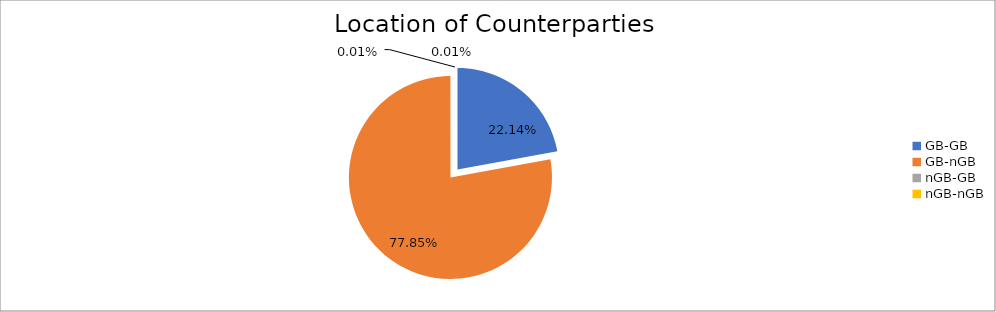
| Category | Series 0 |
|---|---|
| GB-GB | 2008638.949 |
| GB-nGB | 7064402.855 |
| nGB-GB | 598.946 |
| nGB-nGB | 459.289 |